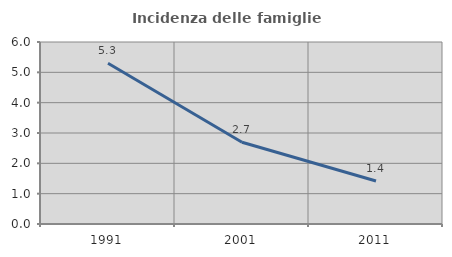
| Category | Incidenza delle famiglie numerose |
|---|---|
| 1991.0 | 5.302 |
| 2001.0 | 2.694 |
| 2011.0 | 1.416 |